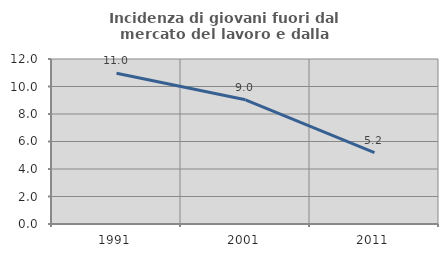
| Category | Incidenza di giovani fuori dal mercato del lavoro e dalla formazione  |
|---|---|
| 1991.0 | 10.961 |
| 2001.0 | 9.032 |
| 2011.0 | 5.193 |